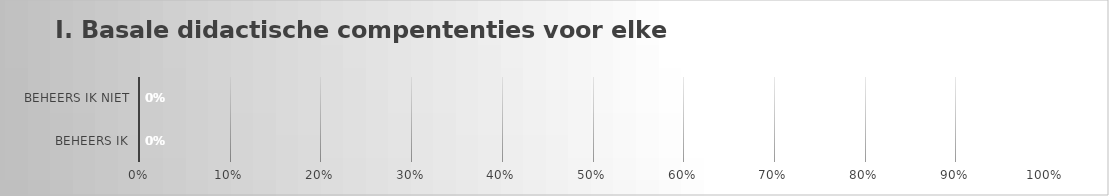
| Category | Didactische competenties voor elke docent  |
|---|---|
| Beheers ik | 0 |
| Beheers ik niet | 0 |